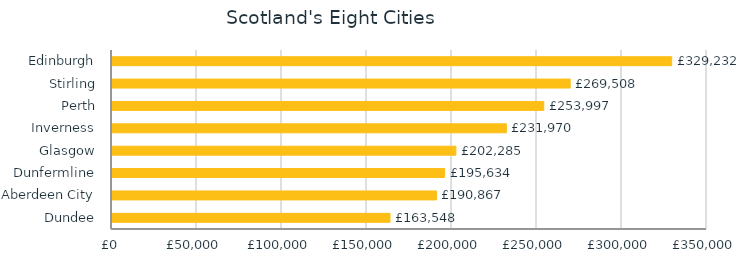
| Category | Series 0 |
|---|---|
| Dundee | 163548.08 |
| Aberdeen City | 190867.342 |
| Dunfermline | 195634.425 |
| Glasgow | 202284.623 |
| Inverness | 231970.065 |
| Perth | 253997.484 |
| Stirling | 269508.419 |
| Edinburgh | 329231.517 |